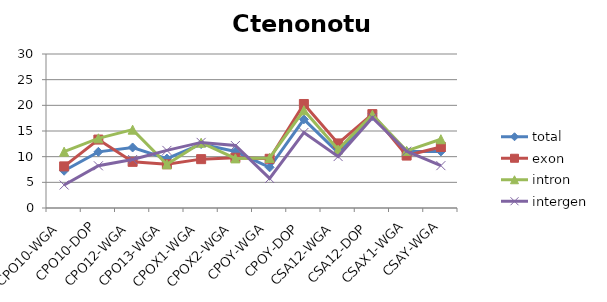
| Category | total  | exon | intron | intergen |
|---|---|---|---|---|
| CPO10-WGA | 7.26 | 8.108 | 10.977 | 4.48 |
| CPO10-DOP | 10.94 | 13.33 | 13.57 | 8.22 |
| CPO12-WGA | 11.79 | 8.99 | 15.26 | 9.44 |
| CPO13-WGA | 9.63 | 8.52 | 8.52 | 11.22 |
| CPOX1-WGA | 12.46 | 9.518 | 12.711 | 12.78 |
| CPOX2-WGA | 11.002 | 9.791 | 9.666 | 12.167 |
| CPOY-WGA | 7.92 | 9.59 | 9.76 | 5.76 |
| CPOY-DOP | 17.27 | 20.26 | 19.04 | 14.71 |
| CSA12-WGA | 10.776 | 12.581 | 11.398 | 10.021 |
| CSA12-DOP | 17.93 | 18.29 | 18.18 | 17.58 |
| CSAX1-WGA | 11.009 | 10.212 | 11.134 | 11.06 |
| CSAY-WGA | 11.018 | 11.886 | 13.396 | 8.254 |